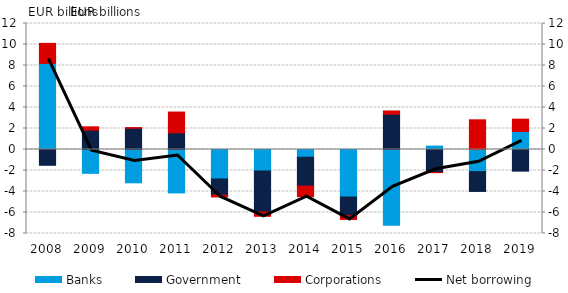
| Category | Banks | Government | Corporations |
|---|---|---|---|
| 2008.0 | 8.199 | -1.505 | 1.907 |
| 2009.0 | -2.269 | 1.843 | 0.318 |
| 2010.0 | -3.173 | 2.021 | 0.066 |
| 2011.0 | -4.137 | 1.588 | 1.979 |
| 2012.0 | -2.805 | -1.54 | -0.177 |
| 2013.0 | -2.046 | -3.904 | -0.41 |
| 2014.0 | -0.735 | -2.748 | -1.014 |
| 2015.0 | -4.524 | -1.766 | -0.367 |
| 2016.0 | -7.217 | 3.354 | 0.315 |
| 2017.0 | 0.324 | -2.19 | -0.015 |
| 2018.0 | -2.102 | -1.892 | 2.827 |
| 2019.0 | 1.715 | -2.061 | 1.173 |